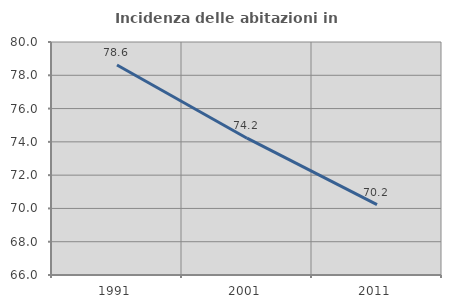
| Category | Incidenza delle abitazioni in proprietà  |
|---|---|
| 1991.0 | 78.615 |
| 2001.0 | 74.22 |
| 2011.0 | 70.228 |